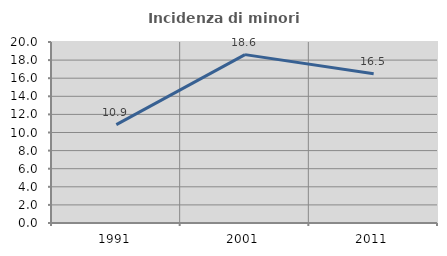
| Category | Incidenza di minori stranieri |
|---|---|
| 1991.0 | 10.87 |
| 2001.0 | 18.605 |
| 2011.0 | 16.502 |